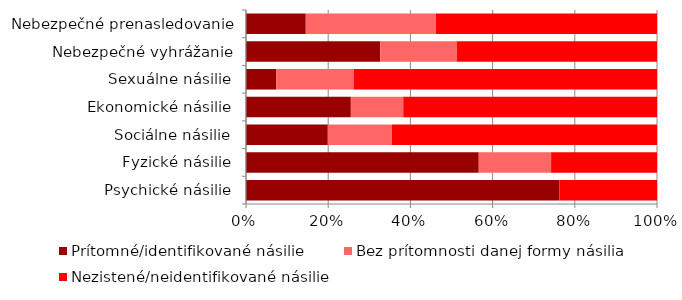
| Category | Prítomné/identifikované násilie | Bez prítomnosti danej formy násilia | Nezistené/neidentifikované násilie |
|---|---|---|---|
| Psychické násilie | 299 | 0 | 93 |
| Fyzické násilie | 222 | 69 | 101 |
| Sociálne násilie | 78 | 61 | 253 |
| Ekonomické násilie | 100 | 50 | 242 |
| Sexuálne násilie | 29 | 74 | 289 |
| Nebezpečné vyhrážanie | 128 | 73 | 191 |
| Nebezpečné prenasledovanie | 57 | 124 | 211 |